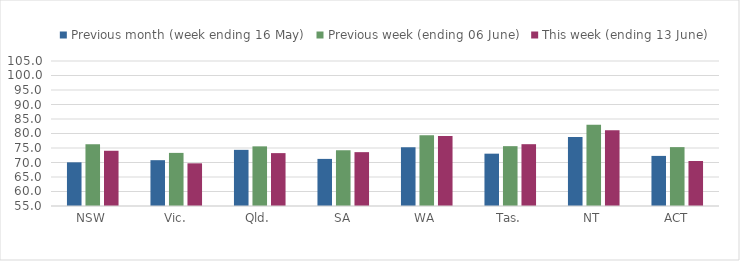
| Category | Previous month (week ending 16 May) | Previous week (ending 06 June) | This week (ending 13 June) |
|---|---|---|---|
| NSW | 70.06 | 76.297 | 74.047 |
| Vic. | 70.8 | 73.313 | 69.715 |
| Qld. | 74.362 | 75.568 | 73.236 |
| SA | 71.242 | 74.226 | 73.57 |
| WA | 75.256 | 79.389 | 79.098 |
| Tas. | 73.045 | 75.634 | 76.314 |
| NT | 78.822 | 82.998 | 81.134 |
| ACT | 72.275 | 75.302 | 70.521 |